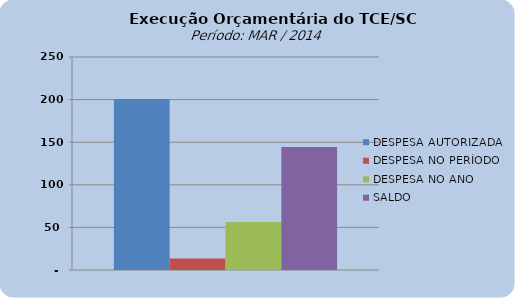
| Category | DESPESA AUTORIZADA | DESPESA NO PERÍODO | DESPESA NO ANO | SALDO |
|---|---|---|---|---|
| 0 | 200733800.18 | 13531376.65 | 56311063.29 | 144422736.89 |